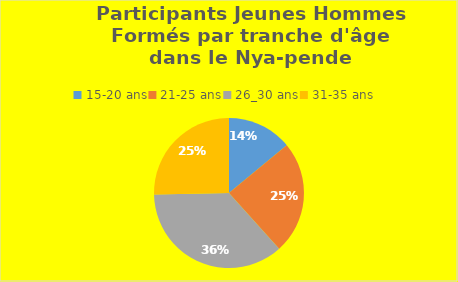
| Category | Nombre |
|---|---|
| 0 | 42 |
| 1 | 73 |
| 2 | 109 |
| 3 | 76 |